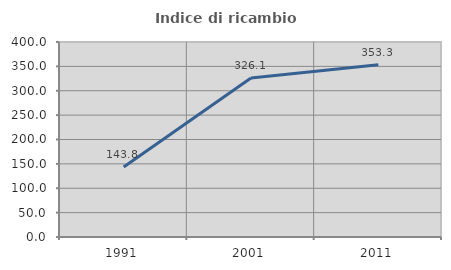
| Category | Indice di ricambio occupazionale  |
|---|---|
| 1991.0 | 143.75 |
| 2001.0 | 326.087 |
| 2011.0 | 353.333 |